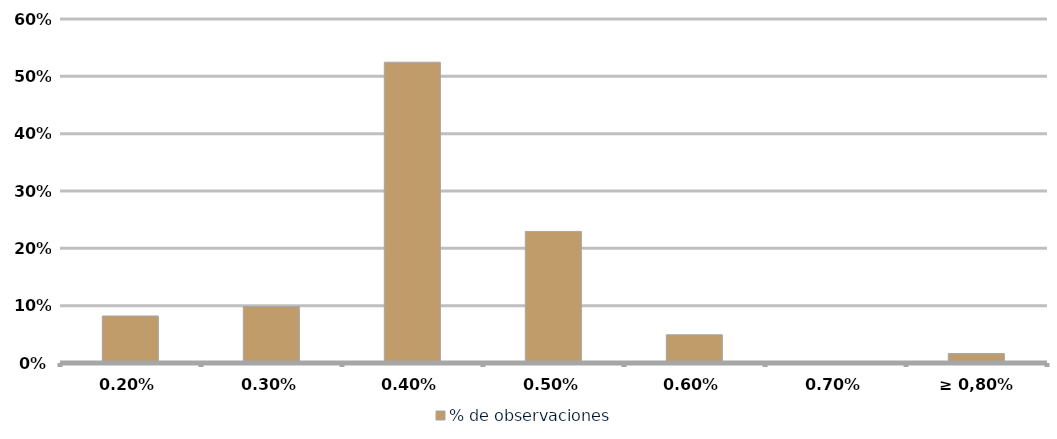
| Category | % de observaciones  |
|---|---|
| 0.20% | 0.082 |
| 0.30% | 0.098 |
| 0.40% | 0.525 |
| 0.50% | 0.23 |
| 0.60% | 0.049 |
| 0.70% | 0 |
| ≥ 0,80% | 0.016 |